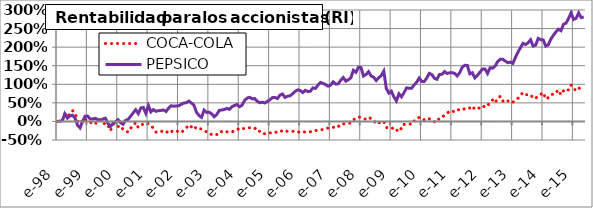
| Category | COCA-COLA | PEPSICO |
|---|---|---|
| 1998-01-01 | 0 | 0 |
| 1998-02-01 | 0 | 0.007 |
| 1998-03-01 | 0.02 | 0.021 |
| 1998-04-01 | 0.212 | 0.207 |
| 1998-05-01 | 0.145 | 0.09 |
| 1998-06-01 | 0.195 | 0.148 |
| 1998-07-01 | 0.291 | 0.166 |
| 1998-08-01 | 0.236 | 0.093 |
| 1998-09-01 | 0.027 | -0.101 |
| 1998-10-01 | -0.151 | -0.174 |
| 1998-11-01 | 0.071 | -0.002 |
| 1998-12-01 | 0.057 | 0.141 |
| 1999-01-01 | 0.013 | 0.143 |
| 1999-02-01 | -0.032 | 0.066 |
| 1999-03-01 | -0.037 | 0.063 |
| 1999-04-01 | -0.076 | 0.084 |
| 1999-05-01 | 0.046 | 0.051 |
| 1999-06-01 | 0.048 | 0.021 |
| 1999-07-01 | -0.014 | 0.065 |
| 1999-08-01 | -0.087 | 0.087 |
| 1999-09-01 | -0.088 | -0.046 |
| 1999-10-01 | -0.252 | -0.141 |
| 1999-11-01 | -0.101 | -0.051 |
| 1999-12-01 | 0.042 | -0.02 |
| 2000-01-01 | -0.139 | 0.047 |
| 2000-02-01 | -0.112 | -0.035 |
| 2000-03-01 | -0.221 | -0.075 |
| 2000-04-01 | -0.244 | 0.03 |
| 2000-05-01 | -0.291 | 0.055 |
| 2000-06-01 | -0.183 | 0.142 |
| 2000-07-01 | -0.102 | 0.23 |
| 2000-08-01 | -0.029 | 0.314 |
| 2000-09-01 | -0.165 | 0.211 |
| 2000-10-01 | -0.12 | 0.36 |
| 2000-11-01 | -0.06 | 0.378 |
| 2000-12-01 | -0.038 | 0.217 |
| 2001-01-01 | -0.057 | 0.427 |
| 2001-02-01 | -0.111 | 0.258 |
| 2001-03-01 | -0.184 | 0.319 |
| 2001-04-01 | -0.288 | 0.272 |
| 2001-05-01 | -0.26 | 0.29 |
| 2001-06-01 | -0.257 | 0.294 |
| 2001-07-01 | -0.289 | 0.31 |
| 2001-08-01 | -0.313 | 0.266 |
| 2001-09-01 | -0.241 | 0.362 |
| 2001-10-01 | -0.279 | 0.423 |
| 2001-11-01 | -0.24 | 0.41 |
| 2001-12-01 | -0.269 | 0.418 |
| 2002-01-01 | -0.259 | 0.42 |
| 2002-02-01 | -0.298 | 0.461 |
| 2002-03-01 | -0.239 | 0.494 |
| 2002-04-01 | -0.175 | 0.504 |
| 2002-05-01 | -0.091 | 0.547 |
| 2002-06-01 | -0.148 | 0.496 |
| 2002-07-01 | -0.108 | 0.437 |
| 2002-08-01 | -0.209 | 0.246 |
| 2002-09-01 | -0.192 | 0.16 |
| 2002-10-01 | -0.204 | 0.11 |
| 2002-11-01 | -0.256 | 0.304 |
| 2002-12-01 | -0.278 | 0.243 |
| 2003-01-01 | -0.3 | 0.247 |
| 2003-02-01 | -0.359 | 0.204 |
| 2003-03-01 | -0.374 | 0.126 |
| 2003-04-01 | -0.351 | 0.186 |
| 2003-05-01 | -0.351 | 0.298 |
| 2003-06-01 | -0.264 | 0.308 |
| 2003-07-01 | -0.25 | 0.321 |
| 2003-08-01 | -0.278 | 0.35 |
| 2003-09-01 | -0.298 | 0.326 |
| 2003-10-01 | -0.288 | 0.394 |
| 2003-11-01 | -0.243 | 0.429 |
| 2003-12-01 | -0.234 | 0.455 |
| 2004-01-01 | -0.173 | 0.397 |
| 2004-02-01 | -0.192 | 0.437 |
| 2004-03-01 | -0.192 | 0.564 |
| 2004-04-01 | -0.172 | 0.628 |
| 2004-05-01 | -0.171 | 0.65 |
| 2004-06-01 | -0.164 | 0.607 |
| 2004-07-01 | -0.171 | 0.617 |
| 2004-08-01 | -0.272 | 0.542 |
| 2004-09-01 | -0.265 | 0.502 |
| 2004-10-01 | -0.333 | 0.519 |
| 2004-11-01 | -0.329 | 0.495 |
| 2004-12-01 | -0.338 | 0.542 |
| 2005-01-01 | -0.308 | 0.583 |
| 2005-02-01 | -0.31 | 0.642 |
| 2005-03-01 | -0.279 | 0.647 |
| 2005-04-01 | -0.306 | 0.615 |
| 2005-05-01 | -0.27 | 0.711 |
| 2005-06-01 | -0.252 | 0.739 |
| 2005-07-01 | -0.288 | 0.645 |
| 2005-08-01 | -0.26 | 0.679 |
| 2005-09-01 | -0.26 | 0.689 |
| 2005-10-01 | -0.266 | 0.746 |
| 2005-11-01 | -0.276 | 0.809 |
| 2005-12-01 | -0.268 | 0.849 |
| 2006-01-01 | -0.311 | 0.833 |
| 2006-02-01 | -0.291 | 0.777 |
| 2006-03-01 | -0.277 | 0.838 |
| 2006-04-01 | -0.279 | 0.803 |
| 2006-05-01 | -0.277 | 0.813 |
| 2006-06-01 | -0.244 | 0.904 |
| 2006-07-01 | -0.248 | 0.887 |
| 2006-08-01 | -0.232 | 0.978 |
| 2006-09-01 | -0.218 | 1.048 |
| 2006-10-01 | -0.223 | 1.024 |
| 2006-11-01 | -0.186 | 0.993 |
| 2006-12-01 | -0.181 | 0.949 |
| 2007-01-01 | -0.152 | 0.977 |
| 2007-02-01 | -0.155 | 1.067 |
| 2007-03-01 | -0.182 | 1.005 |
| 2007-04-01 | -0.141 | 1.013 |
| 2007-05-01 | -0.068 | 1.109 |
| 2007-06-01 | -0.065 | 1.182 |
| 2007-07-01 | -0.063 | 1.085 |
| 2007-08-01 | -0.051 | 1.122 |
| 2007-09-01 | -0.042 | 1.173 |
| 2007-10-01 | 0.038 | 1.377 |
| 2007-11-01 | 0.092 | 1.325 |
| 2007-12-01 | 0.121 | 1.459 |
| 2008-01-01 | 0.106 | 1.449 |
| 2008-02-01 | 0.068 | 1.221 |
| 2008-03-01 | 0.064 | 1.264 |
| 2008-04-01 | 0.115 | 1.34 |
| 2008-05-01 | 0.072 | 1.222 |
| 2008-06-01 | 0.034 | 1.192 |
| 2008-07-01 | -0.069 | 1.103 |
| 2008-08-01 | -0.029 | 1.175 |
| 2008-09-01 | -0.049 | 1.236 |
| 2008-10-01 | -0.004 | 1.353 |
| 2008-11-01 | -0.164 | 0.888 |
| 2008-12-01 | -0.178 | 0.762 |
| 2009-01-01 | -0.16 | 0.813 |
| 2009-02-01 | -0.217 | 0.66 |
| 2009-03-01 | -0.264 | 0.551 |
| 2009-04-01 | -0.159 | 0.744 |
| 2009-05-01 | -0.204 | 0.663 |
| 2009-06-01 | -0.081 | 0.775 |
| 2009-07-01 | -0.071 | 0.904 |
| 2009-08-01 | -0.063 | 0.893 |
| 2009-09-01 | -0.083 | 0.895 |
| 2009-10-01 | 0.012 | 0.985 |
| 2009-11-01 | 0.023 | 1.057 |
| 2009-12-01 | 0.114 | 1.168 |
| 2010-01-01 | 0.093 | 1.079 |
| 2010-02-01 | 0.043 | 1.075 |
| 2010-03-01 | 0.022 | 1.169 |
| 2010-04-01 | 0.07 | 1.296 |
| 2010-05-01 | 0.04 | 1.262 |
| 2010-06-01 | -0.008 | 1.161 |
| 2010-07-01 | -0.024 | 1.134 |
| 2010-08-01 | 0.1 | 1.264 |
| 2010-09-01 | 0.118 | 1.268 |
| 2010-10-01 | 0.162 | 1.342 |
| 2010-11-01 | 0.213 | 1.291 |
| 2010-12-01 | 0.28 | 1.31 |
| 2011-01-01 | 0.291 | 1.315 |
| 2011-02-01 | 0.248 | 1.29 |
| 2011-03-01 | 0.285 | 1.225 |
| 2011-04-01 | 0.34 | 1.313 |
| 2011-05-01 | 0.35 | 1.459 |
| 2011-06-01 | 0.331 | 1.512 |
| 2011-07-01 | 0.367 | 1.508 |
| 2011-08-01 | 0.36 | 1.282 |
| 2011-09-01 | 0.414 | 1.311 |
| 2011-10-01 | 0.322 | 1.172 |
| 2011-11-01 | 0.355 | 1.241 |
| 2011-12-01 | 0.36 | 1.327 |
| 2012-01-01 | 0.424 | 1.409 |
| 2012-02-01 | 0.381 | 1.41 |
| 2012-03-01 | 0.417 | 1.29 |
| 2012-04-01 | 0.52 | 1.443 |
| 2012-05-01 | 0.577 | 1.434 |
| 2012-06-01 | 0.499 | 1.491 |
| 2012-07-01 | 0.629 | 1.611 |
| 2012-08-01 | 0.672 | 1.671 |
| 2012-09-01 | 0.544 | 1.672 |
| 2012-10-01 | 0.595 | 1.626 |
| 2012-11-01 | 0.552 | 1.581 |
| 2012-12-01 | 0.564 | 1.597 |
| 2013-01-01 | 0.517 | 1.563 |
| 2013-02-01 | 0.571 | 1.722 |
| 2013-03-01 | 0.62 | 1.864 |
| 2013-04-01 | 0.705 | 1.984 |
| 2013-05-01 | 0.779 | 2.101 |
| 2013-06-01 | 0.72 | 2.071 |
| 2013-07-01 | 0.717 | 2.116 |
| 2013-08-01 | 0.722 | 2.199 |
| 2013-09-01 | 0.621 | 2.029 |
| 2013-10-01 | 0.623 | 2.054 |
| 2013-11-01 | 0.694 | 2.235 |
| 2013-12-01 | 0.726 | 2.202 |
| 2014-01-01 | 0.779 | 2.195 |
| 2014-02-01 | 0.602 | 2.027 |
| 2014-03-01 | 0.641 | 2.063 |
| 2014-04-01 | 0.667 | 2.215 |
| 2014-05-01 | 0.77 | 2.319 |
| 2014-06-01 | 0.773 | 2.409 |
| 2014-07-01 | 0.849 | 2.483 |
| 2014-08-01 | 0.718 | 2.443 |
| 2014-09-01 | 0.824 | 2.615 |
| 2014-10-01 | 0.882 | 2.646 |
| 2014-11-01 | 0.841 | 2.772 |
| 2014-12-01 | 0.976 | 2.923 |
| 2015-01-01 | 0.872 | 2.746 |
| 2015-02-01 | 0.844 | 2.777 |
| 2015-03-01 | 0.916 | 2.922 |
| 2015-04-01 | 0.819 | 2.793 |
| 2015-05-01 | 0.829 | 2.811 |